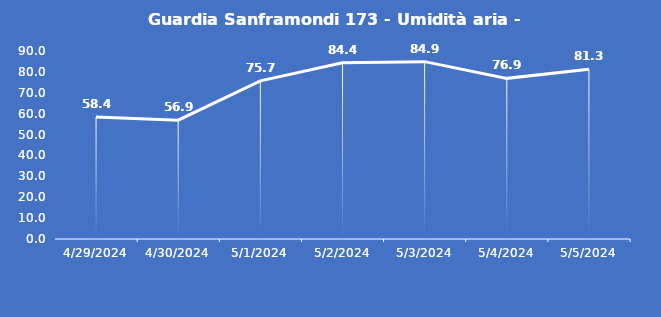
| Category | Guardia Sanframondi 173 - Umidità aria - Grezzo (%) |
|---|---|
| 4/29/24 | 58.4 |
| 4/30/24 | 56.9 |
| 5/1/24 | 75.7 |
| 5/2/24 | 84.4 |
| 5/3/24 | 84.9 |
| 5/4/24 | 76.9 |
| 5/5/24 | 81.3 |